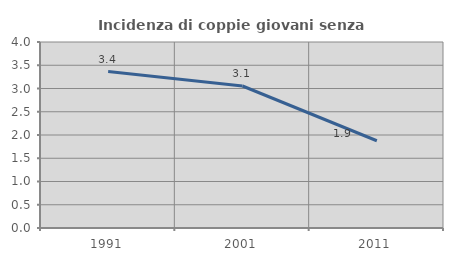
| Category | Incidenza di coppie giovani senza figli |
|---|---|
| 1991.0 | 3.364 |
| 2001.0 | 3.054 |
| 2011.0 | 1.877 |